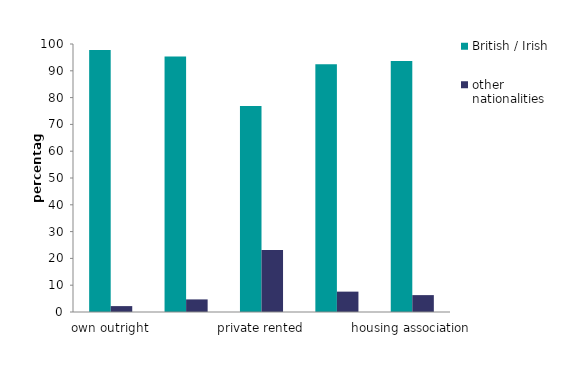
| Category | British / Irish | other nationalities |
|---|---|---|
| own outright | 97.8 | 2.2 |
| buying with a mortgage | 95.3 | 4.7 |
| private rented | 76.9 | 23.1 |
| local authority | 92.4 | 7.6 |
| housing association | 93.7 | 6.3 |